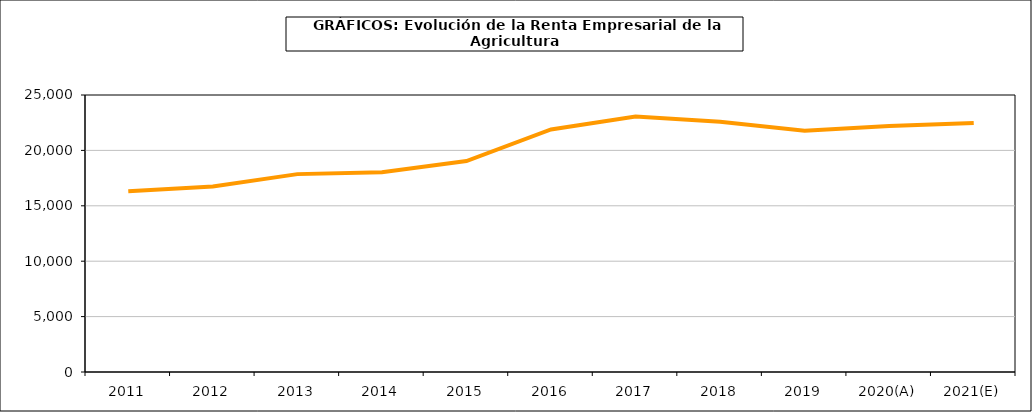
| Category | renta empresarial |
|---|---|
| 2011 | 16322.948 |
| 2012 | 16739.148 |
| 2013 | 17858.951 |
| 2014 | 18029.917 |
| 2015 | 19041.49 |
| 2016 | 21888.067 |
| 2017 | 23056.94 |
| 2018 | 22591.942 |
| 2019 | 21778.011 |
| 2020(A) | 22206.617 |
| 2021(E) | 22482.783 |